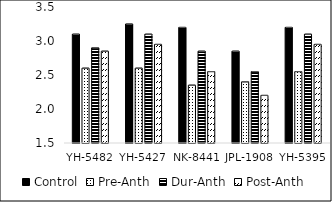
| Category | Control | Pre-Anth | Dur-Anth | Post-Anth |
|---|---|---|---|---|
| YH-5482 | 3.1 | 2.6 | 2.9 | 2.85 |
| YH-5427 | 3.25 | 2.6 | 3.1 | 2.95 |
| NK-8441 | 3.2 | 2.35 | 2.85 | 2.55 |
| JPL-1908 | 2.85 | 2.4 | 2.55 | 2.2 |
| YH-5395 | 3.2 | 2.55 | 3.1 | 2.95 |